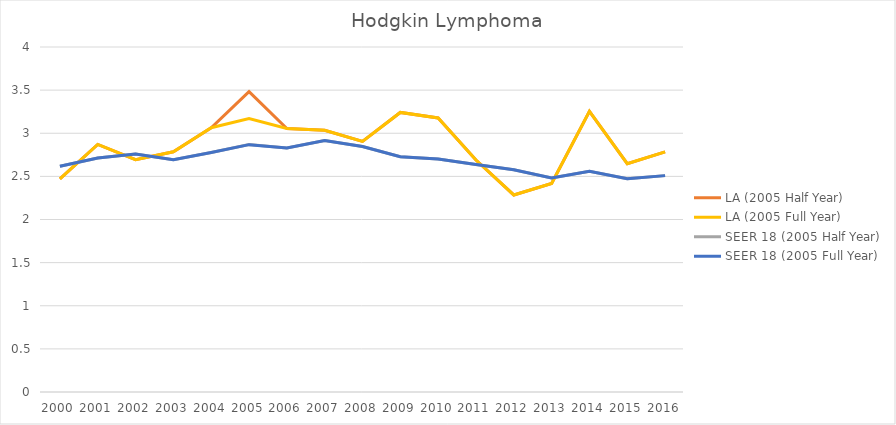
| Category | LA (2005 Half Year) | LA (2005 Full Year) | SEER 18 (2005 Half Year) | SEER 18 (2005 Full Year) |
|---|---|---|---|---|
| 2000.0 | 2.47 | 2.47 | 2.618 | 2.618 |
| 2001.0 | 2.871 | 2.871 | 2.713 | 2.713 |
| 2002.0 | 2.693 | 2.693 | 2.759 | 2.759 |
| 2003.0 | 2.785 | 2.785 | 2.693 | 2.693 |
| 2004.0 | 3.064 | 3.064 | 2.777 | 2.777 |
| 2005.0 | 3.482 | 3.17 | 2.869 | 2.868 |
| 2006.0 | 3.054 | 3.054 | 2.83 | 2.83 |
| 2007.0 | 3.034 | 3.034 | 2.915 | 2.915 |
| 2008.0 | 2.906 | 2.906 | 2.845 | 2.845 |
| 2009.0 | 3.241 | 3.241 | 2.727 | 2.727 |
| 2010.0 | 3.177 | 3.177 | 2.702 | 2.702 |
| 2011.0 | 2.689 | 2.689 | 2.638 | 2.638 |
| 2012.0 | 2.284 | 2.284 | 2.578 | 2.578 |
| 2013.0 | 2.418 | 2.418 | 2.48 | 2.48 |
| 2014.0 | 3.254 | 3.254 | 2.56 | 2.56 |
| 2015.0 | 2.647 | 2.647 | 2.473 | 2.473 |
| 2016.0 | 2.784 | 2.784 | 2.509 | 2.509 |